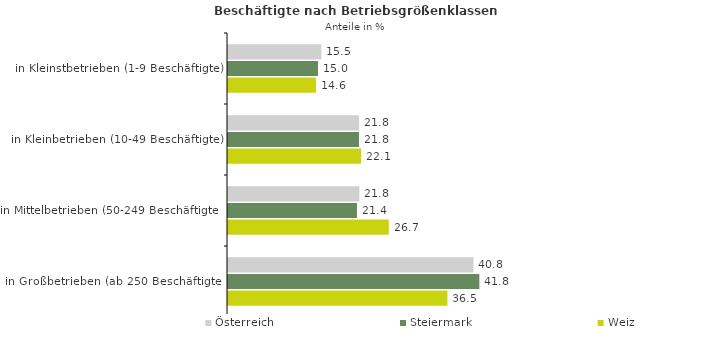
| Category | Österreich | Steiermark | Weiz |
|---|---|---|---|
| in Kleinstbetrieben (1-9 Beschäftigte) | 15.526 | 14.966 | 14.629 |
| in Kleinbetrieben (10-49 Beschäftigte) | 21.796 | 21.781 | 22.134 |
| in Mittelbetrieben (50-249 Beschäftigte) | 21.849 | 21.447 | 26.741 |
| in Großbetrieben (ab 250 Beschäftigte) | 40.829 | 41.806 | 36.496 |